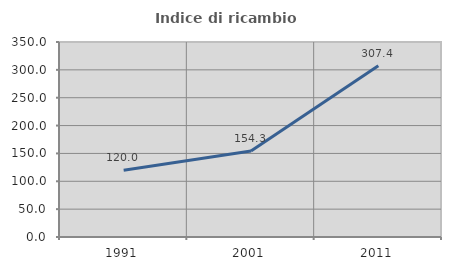
| Category | Indice di ricambio occupazionale  |
|---|---|
| 1991.0 | 120 |
| 2001.0 | 154.286 |
| 2011.0 | 307.407 |